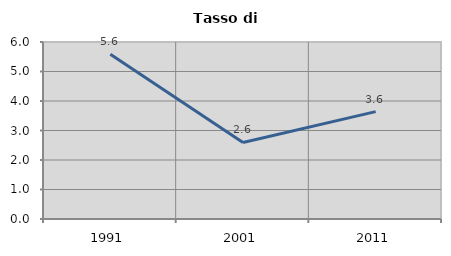
| Category | Tasso di disoccupazione   |
|---|---|
| 1991.0 | 5.587 |
| 2001.0 | 2.595 |
| 2011.0 | 3.64 |